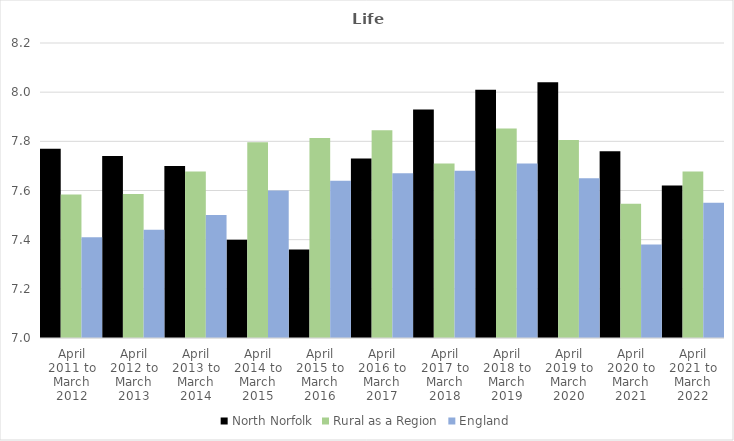
| Category | North Norfolk | Rural as a Region | England |
|---|---|---|---|
| April 2011 to March 2012 | 7.77 | 7.584 | 7.41 |
| April 2012 to March 2013 | 7.74 | 7.586 | 7.44 |
| April 2013 to March 2014 | 7.7 | 7.677 | 7.5 |
| April 2014 to March 2015 | 7.4 | 7.797 | 7.6 |
| April 2015 to March 2016 | 7.36 | 7.813 | 7.64 |
| April 2016 to March 2017 | 7.73 | 7.845 | 7.67 |
| April 2017 to March 2018 | 7.93 | 7.71 | 7.68 |
| April 2018 to March 2019 | 8.01 | 7.852 | 7.71 |
| April 2019 to March 2020 | 8.04 | 7.806 | 7.65 |
| April 2020 to March 2021 | 7.76 | 7.546 | 7.38 |
| April 2021 to March 2022 | 7.62 | 7.677 | 7.55 |